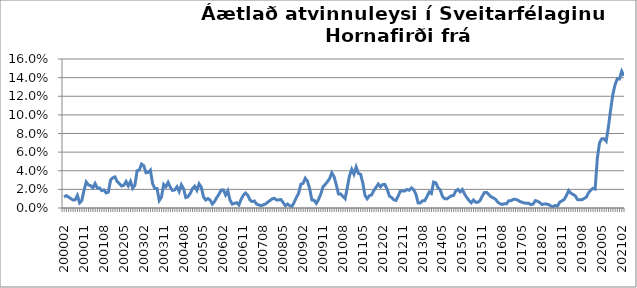
| Category | Series 0 |
|---|---|
| 200002 | 0.012 |
| 200003 | 0.013 |
| 200004 | 0.012 |
| 200005 | 0.01 |
| 200006 | 0.009 |
| 200007 | 0.009 |
| 200008 | 0.014 |
| 200009 | 0.006 |
| 200010 | 0.008 |
| 200011 | 0.019 |
| 200012 | 0.028 |
| 200101 | 0.025 |
| 200102 | 0.024 |
| 200103 | 0.022 |
| 200104 | 0.026 |
| 200105 | 0.022 |
| 200106 | 0.022 |
| 200107 | 0.019 |
| 200108 | 0.019 |
| 200109 | 0.016 |
| 200110 | 0.017 |
| 200111 | 0.03 |
| 200112 | 0.032 |
| 200201 | 0.033 |
| 200202 | 0.028 |
| 200203 | 0.026 |
| 200204 | 0.024 |
| 200205 | 0.024 |
| 200206 | 0.028 |
| 200207 | 0.024 |
| 200208 | 0.029 |
| 200209 | 0.021 |
| 200210 | 0.025 |
| 200211 | 0.04 |
| 200212 | 0.041 |
| 200301 | 0.047 |
| 200302 | 0.045 |
| 200303 | 0.038 |
| 200304 | 0.038 |
| 200305 | 0.041 |
| 200306 | 0.026 |
| 200307 | 0.021 |
| 200308 | 0.021 |
| 200309 | 0.008 |
| 200310 | 0.012 |
| 200311 | 0.025 |
| 200312 | 0.023 |
| 200401 | 0.027 |
| 200402 | 0.022 |
| 200403 | 0.019 |
| 200404 | 0.019 |
| 200405 | 0.023 |
| 200406 | 0.018 |
| 200407 | 0.025 |
| 200408 | 0.021 |
| 200409 | 0.011 |
| 200410 | 0.012 |
| 200411 | 0.016 |
| 200412 | 0.021 |
| 200501 | 0.023 |
| 200502 | 0.019 |
| 200503 | 0.026 |
| 200504 | 0.022 |
| 200505 | 0.012 |
| 200506 | 0.009 |
| 200507 | 0.01 |
| 200508 | 0.008 |
| 200509 | 0.004 |
| 200510 | 0.007 |
| 200511 | 0.011 |
| 200512 | 0.015 |
| 200601 | 0.019 |
| 200602 | 0.019 |
| 200603 | 0.014 |
| 200604 | 0.018 |
| 200605 | 0.008 |
| 200606 | 0.004 |
| 200607 | 0.005 |
| 200608 | 0.006 |
| 200609 | 0.003 |
| 200610 | 0.009 |
| 200611 | 0.014 |
| 200612 | 0.016 |
| 200701 | 0.014 |
| 200702 | 0.009 |
| 200703 | 0.007 |
| 200704 | 0.007 |
| 200705 | 0.004 |
| 200706 | 0.003 |
| 200707 | 0.003 |
| 200708 | 0.003 |
| 200709 | 0.004 |
| 200710 | 0.006 |
| 200711 | 0.008 |
| 200712 | 0.01 |
| 200801 | 0.01 |
| 200802 | 0.009 |
| 200803 | 0.009 |
| 200804 | 0.009 |
| 200805 | 0.006 |
| 200806 | 0.002 |
| 200807 | 0.004 |
| 200808 | 0.003 |
| 200809 | 0.002 |
| 200810 | 0.006 |
| 200811 | 0.011 |
| 200812 | 0.016 |
| 200901 | 0.026 |
| 200902 | 0.026 |
| 200903 | 0.032 |
| 200904 | 0.029 |
| 200905 | 0.02 |
| 200906 | 0.008 |
| 200907 | 0.008 |
| 200908 | 0.005 |
| 200909 | 0.009 |
| 200910 | 0.015 |
| 200911 | 0.023 |
| 200912 | 0.025 |
| 201001 | 0.028 |
| 201002 | 0.032 |
| 201003 | 0.038 |
| 201004 | 0.034 |
| 201005 | 0.025 |
| 201006 | 0.015 |
| 201007 | 0.015 |
| 201008 | 0.012 |
| 201009 | 0.01 |
| 201010 | 0.022 |
| 201011 | 0.035 |
| 201012 | 0.042 |
| 201101 | 0.036 |
| 201102 | 0.044 |
| 201103 | 0.037 |
| 201104 | 0.036 |
| 201105 | 0.027 |
| 201106 | 0.013 |
| 201107 | 0.01 |
| 201108 | 0.013 |
| 201109 | 0.014 |
| 201110 | 0.019 |
| 201111 | 0.022 |
| 201112 | 0.026 |
| 201201 | 0.023 |
| 201202 | 0.025 |
| 201203 | 0.025 |
| 201204 | 0.02 |
| 201205 | 0.013 |
| 201206 | 0.011 |
| 201207 | 0.009 |
| 201208 | 0.008 |
| 201209 | 0.013 |
| 201210 | 0.018 |
| 201211 | 0.018 |
| 201212 | 0.018 |
| 201301 | 0.02 |
| 201302 | 0.019 |
| 201303 | 0.022 |
| 201304 | 0.02 |
| 201305 | 0.015 |
| 201306 | 0.005 |
| 201307 | 0.005 |
| 201308 | 0.008 |
| 201309 | 0.008 |
| 201310 | 0.012 |
| 201311 | 0.017 |
| 201312 | 0.016 |
| 201401* | 0.028 |
| 201402 | 0.027 |
| 201403 | 0.022 |
| 201404 | 0.019 |
| 201405 | 0.013 |
| 201406 | 0.01 |
| 201407 | 0.01 |
| 201408 | 0.011 |
| 201409 | 0.013 |
| 201410 | 0.013 |
| 201411 | 0.018 |
| 201412 | 0.02 |
| 201501 | 0.017 |
| 201502 | 0.02 |
| 201503 | 0.015 |
| 201504 | 0.011 |
| 201505 | 0.008 |
| 201506 | 0.006 |
| 201507 | 0.009 |
| 201508 | 0.006 |
| 201509 | 0.006 |
| 201510 | 0.008 |
| 201511 | 0.013 |
| 201512 | 0.017 |
| 201601 | 0.017 |
| 201602 | 0.014 |
| 201603 | 0.012 |
| 201604 | 0.011 |
| 201605 | 0.009 |
| 201606 | 0.006 |
| 201607 | 0.005 |
| 201608 | 0.004 |
| 201609 | 0.005 |
| 201610 | 0.005 |
| 201611 | 0.008 |
| 201612 | 0.008 |
| 201701 | 0.009 |
| 201702 | 0.009 |
| 201703 | 0.009 |
| 201704 | 0.007 |
| 201705 | 0.006 |
| 201706 | 0.005 |
| 201707 | 0.005 |
| 201708 | 0.005 |
| 201709 | 0.004 |
| 201710 | 0.004 |
| 201711 | 0.008 |
| 201712 | 0.007 |
| 201801 | 0.006 |
| 201802 | 0.004 |
| 201803 | 0.004 |
| 201804 | 0.004 |
| 201805 | 0.004 |
| 201806 | 0.002 |
| 201807 | 0.001 |
| 201808 | 0.003 |
| 201809 | 0.002 |
| 201810 | 0.006 |
| 201811 | 0.008 |
| 201812 | 0.009 |
| 201901 | 0.013 |
| 201902 | 0.019 |
| 201903 | 0.016 |
| 201904 | 0.015 |
| 201905 | 0.013 |
| 201906 | 0.009 |
| 201907 | 0.009 |
| 201908 | 0.009 |
| 201909 | 0.01 |
| 201910 | 0.012 |
| 201911 | 0.016 |
| 201912 | 0.019 |
| 202001 | 0.021 |
| 202002 | 0.02 |
| 202003***  | 0.053 |
| 202004 | 0.07 |
| 202005 | 0.074 |
| 202006 | 0.074 |
| 202007 | 0.072 |
| 202008 | 0.087 |
| 202009 | 0.105 |
| 202010 | 0.122 |
| 202011 | 0.132 |
| 202012 | 0.139 |
| 202101 | 0.138 |
| 202102 | 0.147 |
| 202103 | 0.142 |